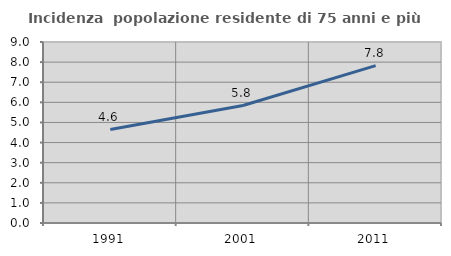
| Category | Incidenza  popolazione residente di 75 anni e più |
|---|---|
| 1991.0 | 4.646 |
| 2001.0 | 5.841 |
| 2011.0 | 7.826 |